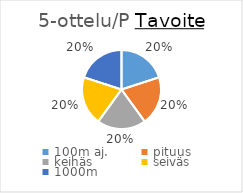
| Category | Series 0 |
|---|---|
| 100m aj. | 1000 |
| pituus | 1000 |
| keihäs | 1000 |
| seiväs | 1000 |
| 1000m | 1000 |